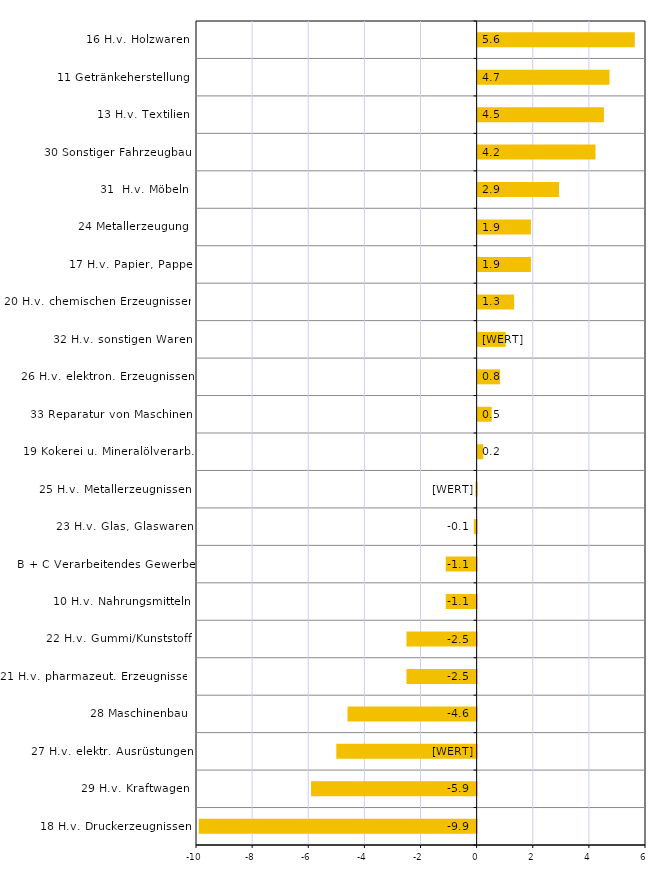
| Category | Series 0 |
|---|---|
| 18 H.v. Druckerzeugnissen | -9.9 |
| 29 H.v. Kraftwagen | -5.9 |
| 27 H.v. elektr. Ausrüstungen | -5 |
| 28 Maschinenbau | -4.6 |
| 21 H.v. pharmazeut. Erzeugnissen | -2.5 |
| 22 H.v. Gummi/Kunststoff | -2.5 |
| 10 H.v. Nahrungsmitteln | -1.1 |
| B + C Verarbeitendes Gewerbe | -1.1 |
| 23 H.v. Glas, Glaswaren | -0.1 |
| 25 H.v. Metallerzeugnissen | -0.04 |
| 19 Kokerei u. Mineralölverarb. | 0.2 |
| 33 Reparatur von Maschinen | 0.5 |
| 26 H.v. elektron. Erzeugnissen | 0.8 |
| 32 H.v. sonstigen Waren | 1 |
| 20 H.v. chemischen Erzeugnissen | 1.3 |
| 17 H.v. Papier, Pappe | 1.9 |
| 24 Metallerzeugung | 1.9 |
| 31  H.v. Möbeln | 2.9 |
| 30 Sonstiger Fahrzeugbau | 4.2 |
| 13 H.v. Textilien | 4.5 |
| 11 Getränkeherstellung | 4.7 |
| 16 H.v. Holzwaren | 5.6 |